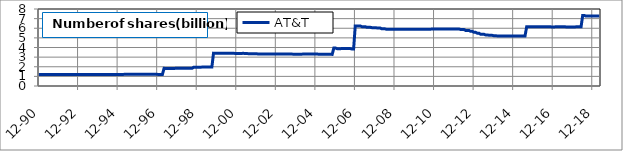
| Category | AT&T |
|---|---|
| 1990-12-31 | 1.2 |
| 1991-01-31 | 1.2 |
| 1991-02-28 | 1.2 |
| 1991-03-29 | 1.2 |
| 1991-04-30 | 1.199 |
| 1991-05-31 | 1.199 |
| 1991-06-28 | 1.201 |
| 1991-07-31 | 1.201 |
| 1991-08-30 | 1.201 |
| 1991-09-30 | 1.199 |
| 1991-10-31 | 1.199 |
| 1991-11-29 | 1.199 |
| 1991-12-31 | 1.199 |
| 1992-01-31 | 1.199 |
| 1992-02-28 | 1.199 |
| 1992-03-31 | 1.199 |
| 1992-04-30 | 1.199 |
| 1992-05-29 | 1.201 |
| 1992-06-30 | 1.201 |
| 1992-07-31 | 1.201 |
| 1992-08-31 | 1.201 |
| 1992-09-30 | 1.2 |
| 1992-10-30 | 1.2 |
| 1992-11-30 | 1.2 |
| 1992-12-31 | 1.199 |
| 1993-01-29 | 1.199 |
| 1993-02-26 | 1.199 |
| 1993-03-31 | 1.199 |
| 1993-04-30 | 1.199 |
| 1993-05-31 | 1.199 |
| 1993-06-30 | 1.2 |
| 1993-07-30 | 1.2 |
| 1993-08-31 | 1.197 |
| 1993-09-30 | 1.197 |
| 1993-10-29 | 1.197 |
| 1993-11-30 | 1.199 |
| 1993-12-31 | 1.199 |
| 1994-01-31 | 1.199 |
| 1994-02-28 | 1.199 |
| 1994-03-31 | 1.199 |
| 1994-04-29 | 1.199 |
| 1994-05-31 | 1.199 |
| 1994-06-30 | 1.2 |
| 1994-07-29 | 1.2 |
| 1994-08-31 | 1.201 |
| 1994-09-30 | 1.204 |
| 1994-10-31 | 1.204 |
| 1994-11-30 | 1.199 |
| 1994-12-30 | 1.199 |
| 1995-01-31 | 1.199 |
| 1995-02-28 | 1.199 |
| 1995-03-31 | 1.199 |
| 1995-04-28 | 1.215 |
| 1995-05-31 | 1.215 |
| 1995-06-30 | 1.215 |
| 1995-07-31 | 1.215 |
| 1995-08-31 | 1.215 |
| 1995-09-29 | 1.219 |
| 1995-10-31 | 1.219 |
| 1995-11-30 | 1.219 |
| 1995-12-29 | 1.22 |
| 1996-01-31 | 1.22 |
| 1996-02-29 | 1.22 |
| 1996-03-29 | 1.218 |
| 1996-04-30 | 1.218 |
| 1996-05-31 | 1.218 |
| 1996-06-28 | 1.218 |
| 1996-07-31 | 1.218 |
| 1996-08-30 | 1.219 |
| 1996-09-30 | 1.219 |
| 1996-10-31 | 1.219 |
| 1996-11-29 | 1.219 |
| 1996-12-31 | 1.207 |
| 1997-01-31 | 1.207 |
| 1997-02-28 | 1.207 |
| 1997-03-31 | 1.207 |
| 1997-04-30 | 1.834 |
| 1997-05-30 | 1.824 |
| 1997-06-30 | 1.824 |
| 1997-07-31 | 1.824 |
| 1997-08-29 | 1.828 |
| 1997-09-30 | 1.828 |
| 1997-10-31 | 1.828 |
| 1997-11-28 | 1.833 |
| 1997-12-31 | 1.833 |
| 1998-01-30 | 1.833 |
| 1998-02-27 | 1.833 |
| 1998-03-31 | 1.839 |
| 1998-04-30 | 1.839 |
| 1998-05-29 | 1.839 |
| 1998-06-30 | 1.839 |
| 1998-07-31 | 1.839 |
| 1998-08-31 | 1.837 |
| 1998-09-30 | 1.837 |
| 1998-10-30 | 1.957 |
| 1998-11-30 | 1.956 |
| 1998-12-31 | 1.956 |
| 1999-01-29 | 1.956 |
| 1999-02-26 | 1.956 |
| 1999-03-31 | 1.962 |
| 1999-04-30 | 1.962 |
| 1999-05-31 | 1.964 |
| 1999-06-30 | 1.964 |
| 1999-07-30 | 1.964 |
| 1999-08-31 | 1.967 |
| 1999-09-30 | 1.967 |
| 1999-10-29 | 3.414 |
| 1999-11-30 | 3.411 |
| 1999-12-31 | 3.411 |
| 2000-01-31 | 3.411 |
| 2000-02-29 | 3.411 |
| 2000-03-31 | 3.399 |
| 2000-04-28 | 3.399 |
| 2000-05-31 | 3.402 |
| 2000-06-30 | 3.402 |
| 2000-07-31 | 3.402 |
| 2000-08-31 | 3.402 |
| 2000-09-29 | 3.402 |
| 2000-10-31 | 3.402 |
| 2000-11-30 | 3.385 |
| 2000-12-29 | 3.385 |
| 2001-01-31 | 3.385 |
| 2001-02-28 | 3.385 |
| 2001-03-30 | 3.378 |
| 2001-04-30 | 3.402 |
| 2001-05-31 | 3.368 |
| 2001-06-29 | 3.368 |
| 2001-07-31 | 3.362 |
| 2001-08-31 | 3.362 |
| 2001-09-28 | 3.362 |
| 2001-10-31 | 3.362 |
| 2001-11-30 | 3.362 |
| 2001-12-31 | 3.362 |
| 2002-01-31 | 3.32 |
| 2002-02-28 | 3.32 |
| 2002-03-29 | 3.32 |
| 2002-04-30 | 3.32 |
| 2002-05-31 | 3.32 |
| 2002-06-28 | 3.32 |
| 2002-07-31 | 3.32 |
| 2002-08-30 | 3.32 |
| 2002-09-30 | 3.32 |
| 2002-10-31 | 3.32 |
| 2002-11-29 | 3.32 |
| 2002-12-31 | 3.32 |
| 2003-01-31 | 3.32 |
| 2003-02-28 | 3.32 |
| 2003-03-31 | 3.32 |
| 2003-04-30 | 3.322 |
| 2003-05-30 | 3.322 |
| 2003-06-30 | 3.322 |
| 2003-07-31 | 3.324 |
| 2003-08-29 | 3.324 |
| 2003-09-30 | 3.324 |
| 2003-10-31 | 3.311 |
| 2003-11-28 | 3.311 |
| 2003-12-31 | 3.311 |
| 2004-01-30 | 3.311 |
| 2004-02-27 | 3.308 |
| 2004-03-31 | 3.308 |
| 2004-04-30 | 3.312 |
| 2004-05-31 | 3.312 |
| 2004-06-30 | 3.312 |
| 2004-07-30 | 3.314 |
| 2004-08-31 | 3.314 |
| 2004-09-30 | 3.314 |
| 2004-10-29 | 3.315 |
| 2004-11-30 | 3.315 |
| 2004-12-31 | 3.315 |
| 2005-01-31 | 3.315 |
| 2005-02-28 | 3.303 |
| 2005-03-31 | 3.303 |
| 2005-04-29 | 3.303 |
| 2005-05-31 | 3.303 |
| 2005-06-30 | 3.303 |
| 2005-07-29 | 3.304 |
| 2005-08-31 | 3.304 |
| 2005-09-30 | 3.304 |
| 2005-10-31 | 3.281 |
| 2005-11-30 | 3.944 |
| 2005-12-30 | 3.944 |
| 2006-01-31 | 3.88 |
| 2006-02-28 | 3.88 |
| 2006-03-31 | 3.88 |
| 2006-04-28 | 3.888 |
| 2006-05-31 | 3.888 |
| 2006-06-30 | 3.888 |
| 2006-07-31 | 3.884 |
| 2006-08-31 | 3.884 |
| 2006-09-29 | 3.884 |
| 2006-10-31 | 3.843 |
| 2006-11-30 | 3.843 |
| 2006-12-29 | 6.239 |
| 2007-01-31 | 6.244 |
| 2007-02-28 | 6.244 |
| 2007-03-30 | 6.244 |
| 2007-04-30 | 6.166 |
| 2007-05-31 | 6.166 |
| 2007-06-29 | 6.166 |
| 2007-07-31 | 6.099 |
| 2007-08-31 | 6.099 |
| 2007-09-28 | 6.099 |
| 2007-10-31 | 6.065 |
| 2007-11-30 | 6.065 |
| 2007-12-31 | 6.065 |
| 2008-01-31 | 6.036 |
| 2008-02-29 | 6.036 |
| 2008-03-31 | 6.036 |
| 2008-04-30 | 5.941 |
| 2008-05-30 | 5.941 |
| 2008-06-30 | 5.941 |
| 2008-07-31 | 5.893 |
| 2008-08-29 | 5.893 |
| 2008-09-30 | 5.893 |
| 2008-10-31 | 5.893 |
| 2008-11-28 | 5.893 |
| 2008-12-31 | 5.893 |
| 2009-01-30 | 5.893 |
| 2009-02-27 | 5.893 |
| 2009-03-31 | 5.893 |
| 2009-04-30 | 5.9 |
| 2009-05-29 | 5.9 |
| 2009-06-30 | 5.9 |
| 2009-07-31 | 5.9 |
| 2009-08-31 | 5.9 |
| 2009-09-30 | 5.9 |
| 2009-10-30 | 5.9 |
| 2009-11-30 | 5.901 |
| 2009-12-31 | 5.901 |
| 2010-01-29 | 5.901 |
| 2010-02-26 | 5.902 |
| 2010-03-31 | 5.902 |
| 2010-04-30 | 5.909 |
| 2010-05-31 | 5.909 |
| 2010-06-30 | 5.909 |
| 2010-07-30 | 5.909 |
| 2010-08-31 | 5.909 |
| 2010-09-30 | 5.909 |
| 2010-10-29 | 5.909 |
| 2010-11-30 | 5.91 |
| 2010-12-31 | 5.91 |
| 2011-01-31 | 5.911 |
| 2011-02-28 | 5.911 |
| 2011-03-31 | 5.911 |
| 2011-04-29 | 5.922 |
| 2011-05-31 | 5.922 |
| 2011-06-30 | 5.922 |
| 2011-07-29 | 5.926 |
| 2011-08-31 | 5.926 |
| 2011-09-30 | 5.926 |
| 2011-10-31 | 5.926 |
| 2011-11-30 | 5.926 |
| 2011-12-30 | 5.926 |
| 2012-01-31 | 5.929 |
| 2012-02-29 | 5.929 |
| 2012-03-30 | 5.929 |
| 2012-04-30 | 5.863 |
| 2012-05-31 | 5.863 |
| 2012-06-29 | 5.863 |
| 2012-07-31 | 5.769 |
| 2012-08-31 | 5.769 |
| 2012-09-28 | 5.769 |
| 2012-10-31 | 5.68 |
| 2012-11-30 | 5.68 |
| 2012-12-31 | 5.581 |
| 2013-01-31 | 5.581 |
| 2013-02-28 | 5.492 |
| 2013-03-29 | 5.492 |
| 2013-04-30 | 5.38 |
| 2013-05-31 | 5.38 |
| 2013-06-28 | 5.38 |
| 2013-07-31 | 5.311 |
| 2013-08-30 | 5.311 |
| 2013-09-30 | 5.28 |
| 2013-10-31 | 5.268 |
| 2013-11-30 | 5.268 |
| 2013-12-31 | 5.226 |
| 2014-01-31 | 5.213 |
| 2014-02-28 | 5.207 |
| 2014-03-31 | 5.195 |
| 2014-04-30 | 5.19 |
| 2014-05-31 | 5.19 |
| 2014-06-30 | 5.191 |
| 2014-07-31 | 5.186 |
| 2014-08-31 | 5.186 |
| 2014-09-30 | 5.186 |
| 2014-10-31 | 5.187 |
| 2014-11-30 | 5.187 |
| 2014-12-31 | 5.187 |
| 2015-01-30 | 5.187 |
| 2015-02-27 | 5.19 |
| 2015-03-31 | 5.19 |
| 2015-04-30 | 5.193 |
| 2015-05-29 | 5.193 |
| 2015-06-30 | 5.193 |
| 2015-07-31 | 5.193 |
| 2015-08-31 | 6.151 |
| 2015-09-30 | 6.151 |
| 2015-10-30 | 6.151 |
| 2015-11-30 | 6.152 |
| 2015-12-31 | 6.152 |
| 2016-01-29 | 6.152 |
| 2016-02-29 | 6.151 |
| 2016-03-31 | 6.151 |
| 2016-04-29 | 6.151 |
| 2016-05-31 | 6.156 |
| 2016-06-30 | 6.156 |
| 2016-07-29 | 6.156 |
| 2016-08-31 | 6.152 |
| 2016-09-30 | 6.152 |
| 2016-10-31 | 6.152 |
| 2016-11-30 | 6.141 |
| 2016-12-30 | 6.141 |
| 2017-01-31 | 6.141 |
| 2017-02-28 | 6.154 |
| 2017-03-31 | 6.154 |
| 2017-04-28 | 6.154 |
| 2017-05-31 | 6.148 |
| 2017-06-30 | 6.148 |
| 2017-07-31 | 6.148 |
| 2017-08-31 | 6.14 |
| 2017-09-29 | 6.14 |
| 2017-10-31 | 6.14 |
| 2017-11-30 | 6.139 |
| 2017-12-29 | 6.139 |
| 2018-01-31 | 6.139 |
| 2018-02-28 | 6.144 |
| 2018-03-30 | 6.144 |
| 2018-04-30 | 6.144 |
| 2018-05-31 | 6.144 |
| 2018-06-29 | 7.326 |
| 2018-07-31 | 7.326 |
| 2018-08-31 | 7.262 |
| 2018-09-28 | 7.262 |
| 2018-10-31 | 7.262 |
| 2018-11-30 | 7.278 |
| 2018-12-31 | 7.278 |
| 2019-01-31 | 7.278 |
| 2019-02-28 | 7.285 |
| 2019-03-29 | 7.285 |
| 2019-04-30 | 7.285 |